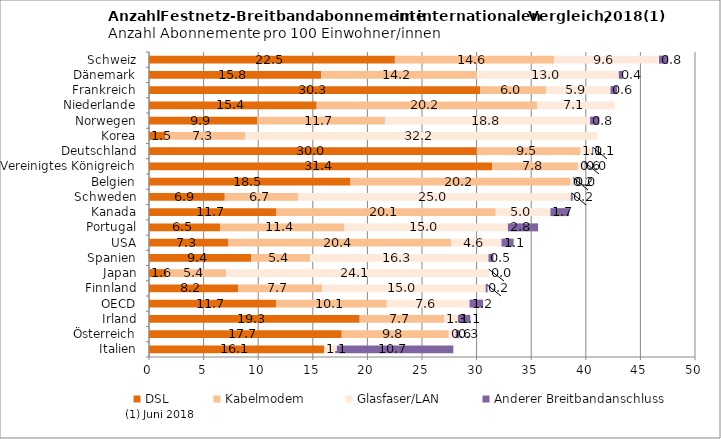
| Category | DSL  | Kabelmodem | Glasfaser/LAN | Anderer Breitbandanschluss  |
|---|---|---|---|---|
| Italien | 16.06 | 0 | 1.149 | 10.659 |
| Österreich | 17.65 | 9.796 | 0.642 | 0.329 |
| Irland | 19.29 | 7.734 | 1.265 | 1.137 |
| OECD | 11.66 | 10.113 | 7.584 | 1.237 |
| Finnland | 8.15 | 7.698 | 14.978 | 0.181 |
| Japan | 1.61 | 5.444 | 24.051 | 0.004 |
| Spanien | 9.37 | 5.391 | 16.327 | 0.465 |
| USA | 7.28 | 20.398 | 4.605 | 1.107 |
| Portugal | 6.54 | 11.365 | 14.962 | 2.764 |
| Kanada | 11.68 | 20.08 | 4.997 | 1.716 |
| Schweden | 6.94 | 6.73 | 24.959 | 0.174 |
| Belgien | 18.46 | 20.15 | 0.218 | 0.046 |
| Vereinigtes Königreich | 31.44 | 7.833 | 0.607 | 0.027 |
| Deutschland | 30.02 | 9.492 | 1.07 | 0.101 |
| Korea | 1.49 | 7.345 | 32.19 | 0 |
| Norwegen | 9.94 | 11.667 | 18.784 | 0.836 |
| Niederlande | 15.36 | 20.168 | 7.127 | 0 |
| Frankreich | 30.34 | 6.035 | 5.885 | 0.613 |
| Dänemark | 15.77 | 14.216 | 13.037 | 0.369 |
| Schweiz | 22.52 | 14.565 | 9.619 | 0.817 |